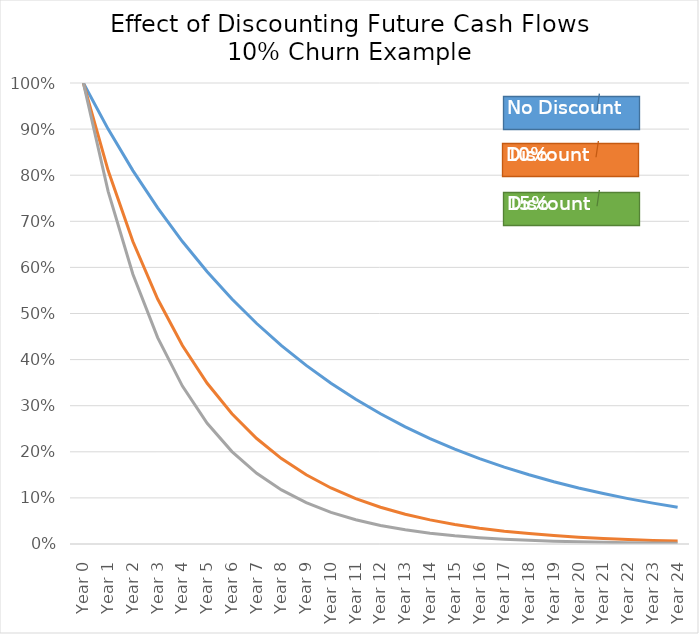
| Category | % Dollars | % Dollars - 10% discount | % Dollars - 15% discount |
|---|---|---|---|
| Year 0 | 1 | 1 | 1 |
| Year 1 | 0.9 | 0.81 | 0.765 |
| Year 2 | 0.81 | 0.656 | 0.585 |
| Year 3 | 0.729 | 0.531 | 0.448 |
| Year 4 | 0.656 | 0.43 | 0.342 |
| Year 5 | 0.59 | 0.349 | 0.262 |
| Year 6 | 0.531 | 0.282 | 0.2 |
| Year 7 | 0.478 | 0.229 | 0.153 |
| Year 8 | 0.43 | 0.185 | 0.117 |
| Year 9 | 0.387 | 0.15 | 0.09 |
| Year 10 | 0.349 | 0.122 | 0.069 |
| Year 11 | 0.314 | 0.098 | 0.053 |
| Year 12 | 0.282 | 0.08 | 0.04 |
| Year 13 | 0.254 | 0.065 | 0.031 |
| Year 14 | 0.229 | 0.052 | 0.024 |
| Year 15 | 0.206 | 0.042 | 0.018 |
| Year 16 | 0.185 | 0.034 | 0.014 |
| Year 17 | 0.167 | 0.028 | 0.011 |
| Year 18 | 0.15 | 0.023 | 0.008 |
| Year 19 | 0.135 | 0.018 | 0.006 |
| Year 20 | 0.122 | 0.015 | 0.005 |
| Year 21 | 0.109 | 0.012 | 0.004 |
| Year 22 | 0.098 | 0.01 | 0.003 |
| Year 23 | 0.089 | 0.008 | 0.002 |
| Year 24 | 0.08 | 0.006 | 0.002 |